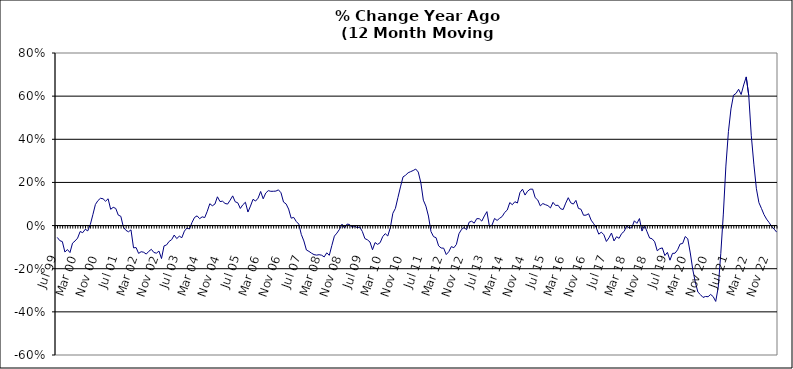
| Category | Series 0 |
|---|---|
| Jul 99 | -0.055 |
| Aug 99 | -0.07 |
| Sep 99 | -0.074 |
| Oct 99 | -0.123 |
| Nov 99 | -0.111 |
| Dec 99 | -0.125 |
| Jan 00 | -0.082 |
| Feb 00 | -0.071 |
| Mar 00 | -0.058 |
| Apr 00 | -0.027 |
| May 00 | -0.033 |
| Jun 00 | -0.017 |
| Jul 00 | -0.025 |
| Aug 00 | 0.005 |
| Sep 00 | 0.05 |
| Oct 00 | 0.098 |
| Nov 00 | 0.116 |
| Dec 00 | 0.127 |
| Jan 01 | 0.124 |
| Feb 01 | 0.113 |
| Mar 01 | 0.124 |
| Apr 01 | 0.075 |
| May 01 | 0.085 |
| Jun 01 | 0.08 |
| Jul 01 | 0.048 |
| Aug 01 | 0.043 |
| Sep 01 | -0.007 |
| Oct 01 | -0.022 |
| Nov 01 | -0.029 |
| Dec 01 | -0.02 |
| Jan 02 | -0.103 |
| Feb 02 | -0.102 |
| Mar 02 | -0.129 |
| Apr 02 | -0.121 |
| May 02 | -0.124 |
| Jun 02 | -0.132 |
| Jul 02 | -0.119 |
| Aug 02 | -0.11 |
| Sep 02 | -0.125 |
| Oct 02 | -0.128 |
| Nov 02 | -0.118 |
| Dec 02 | -0.153 |
| Jan 03 | -0.094 |
| Feb 03 | -0.09 |
| Mar 03 | -0.073 |
| Apr 03 | -0.065 |
| May 03 | -0.044 |
| Jun 03 | -0.06 |
| Jul 03 | -0.049 |
| Aug 03 | -0.056 |
| Sep 03 | -0.026 |
| Oct 03 | -0.012 |
| Nov 03 | -0.016 |
| Dec 03 | 0.014 |
| Jan 04 | 0.038 |
| Feb 04 | 0.045 |
| Mar 04 | 0.032 |
| Apr 04 | 0.041 |
| May 04 | 0.037 |
| Jun 04 | 0.066 |
| Jul 04 | 0.101 |
| Aug 04 | 0.092 |
| Sep 04 | 0.1 |
| Oct 04 | 0.133 |
| Nov 04 | 0.111 |
| Dec 04 | 0.113 |
| Jan 05 | 0.103 |
| Feb 05 | 0.1 |
| Mar 05 | 0.118 |
| Apr 05 | 0.138 |
| May 05 | 0.11 |
| Jun 05 | 0.106 |
| Jul 05 | 0.079 |
| Aug 05 | 0.097 |
| Sep 05 | 0.108 |
| Oct 05 | 0.063 |
| Nov 05 | 0.09 |
| Dec 05 | 0.122 |
| Jan 06 | 0.114 |
| Feb 06 | 0.127 |
| Mar 06 | 0.158 |
| Apr 06 | 0.124 |
| May 06 | 0.151 |
| Jun 06 | 0.162 |
| Jul 06 | 0.159 |
| Aug 06 | 0.159 |
| Sep 06 | 0.16 |
| Oct 06 | 0.166 |
| Nov 06 | 0.152 |
| Dec 06 | 0.109 |
| Jan 07 | 0.101 |
| Feb 07 | 0.076 |
| Mar 07 | 0.034 |
| Apr 07 | 0.038 |
| May 07 | 0.019 |
| Jun 07 | 0.007 |
| Jul 07 | -0.041 |
| Aug 07 | -0.071 |
| Sep 07 | -0.113 |
| Oct 07 | -0.12 |
| Nov 07 | -0.128 |
| Dec 07 | -0.135 |
| Jan 08 | -0.137 |
| Feb 08 | -0.135 |
| Mar 08 | -0.137 |
| Apr 08 | -0.145 |
| May 08 | -0.126 |
| Jun 08 | -0.138 |
| Jul 08 | -0.093 |
| Aug 08 | -0.049 |
| Sep-08 | -0.035 |
| Oct 08 | -0.018 |
| Nov 08 | 0.007 |
| Dec 08 | -0.011 |
| Jan 09 | 0.007 |
| Feb 09 | 0.005 |
| Mar 09 | -0.009 |
| Apr 09 | -0.003 |
| May 09 | -0.01 |
| Jun 09 | -0.007 |
| Jul 09 | -0.027 |
| Aug 09 | -0.06 |
| Sep 09 | -0.066 |
| Oct 09 | -0.076 |
| Nov 09 | -0.112 |
| Dec 09 | -0.079 |
| Jan 10 | -0.087 |
| Feb 10 | -0.079 |
| Mar 10 | -0.052 |
| Apr 10 | -0.037 |
| May 10 | -0.048 |
| Jun 10 | -0.01 |
| Jul 10 | 0.057 |
| Aug 10 | 0.08 |
| Sep 10 | 0.13 |
| Oct 10 | 0.179 |
| Nov 10 | 0.226 |
| Dec 10 | 0.233 |
| Jan 11 | 0.245 |
| Feb 11 | 0.25 |
| Mar 11 | 0.255 |
| Apr 11 | 0.262 |
| May 11 | 0.248 |
| Jun 11 | 0.199 |
| Jul 11 | 0.118 |
| Aug 11 | 0.09 |
| Sep 11 | 0.044 |
| Oct 11 | -0.028 |
| Nov 11 | -0.051 |
| Dec 11 | -0.056 |
| Jan 12 | -0.094 |
| Feb 12 | -0.104 |
| Mar 12 | -0.105 |
| Apr 12 | -0.134 |
| May 12 | -0.121 |
| Jun 12 | -0.098 |
| Jul 12 | -0.103 |
| Aug 12 | -0.087 |
| Sep 12 | -0.038 |
| Oct 12 | -0.018 |
| Nov 12 | -0.009 |
| Dec 12 | -0.019 |
| Jan 13 | 0.016 |
| Feb-13 | 0.02 |
| Mar-13 | 0.011 |
| Apr 13 | 0.032 |
| May 13 | 0.032 |
| Jun-13 | 0.021 |
| Jul 13 | 0.045 |
| Aug 13 | 0.065 |
| Sep 13 | -0.005 |
| Oct 13 | 0.002 |
| Nov 13 | 0.033 |
| Dec 13 | 0.024 |
| Jan 14 | 0.034 |
| Feb-14 | 0.042 |
| Mar 14 | 0.061 |
| Apr 14 | 0.072 |
| May 14 | 0.107 |
| Jun 14 | 0.097 |
| Jul-14 | 0.111 |
| Aug-14 | 0.105 |
| Sep 14 | 0.153 |
| Oct 14 | 0.169 |
| Nov 14 | 0.141 |
| Dec 14 | 0.159 |
| Jan 15 | 0.169 |
| Feb 15 | 0.169 |
| Mar 15 | 0.129 |
| Apr-15 | 0.118 |
| May 15 | 0.091 |
| Jun-15 | 0.102 |
| Jul 15 | 0.097 |
| Aug 15 | 0.092 |
| Sep 15 | 0.082 |
| Oct 15 | 0.108 |
| Nov 15 | 0.093 |
| Dec 15 | 0.094 |
| Jan 16 | 0.078 |
| Feb 16 | 0.075 |
| Mar 16 | 0.104 |
| Apr 16 | 0.129 |
| May 16 | 0.105 |
| Jun 16 | 0.1 |
| Jul 16 | 0.117 |
| Aug 16 | 0.08 |
| Sep 16 | 0.076 |
| Oct 16 | 0.048 |
| Nov 16 | 0.048 |
| Dec 16 | 0.055 |
| Jan 17 | 0.025 |
| Feb 17 | 0.009 |
| Mar 17 | -0.01 |
| Apr 17 | -0.04 |
| May 17 | -0.031 |
| Jun 17 | -0.042 |
| Jul 17 | -0.074 |
| Aug 17 | -0.057 |
| Sep 17 | -0.035 |
| Oct 17 | -0.071 |
| Nov 17 | -0.052 |
| Dec 17 | -0.059 |
| Jan 18 | -0.037 |
| Feb 18 | -0.027 |
| Mar 18 | 0 |
| Apr 18 | -0.012 |
| May 18 | -0.009 |
| Jun 18 | 0.022 |
| Jul 18 | 0.01 |
| Aug 18 | 0.033 |
| Sep 18 | -0.025 |
| Oct 18 | 0.002 |
| Nov 18 | -0.029 |
| Dec 18 | -0.058 |
| Jan 19 | -0.061 |
| Feb 19 | -0.075 |
| Mar 19 | -0.117 |
| Apr 19 | -0.107 |
| May 19 | -0.104 |
| Jun 19 | -0.139 |
| Jul 19 | -0.124 |
| Aug 19 | -0.16 |
| Sep 19 | -0.129 |
| Oct 19 | -0.128 |
| Nov 19 | -0.112 |
| Dec 19 | -0.085 |
| Jan 20 | -0.083 |
| Feb 20 | -0.051 |
| Mar 20 | -0.061 |
| Apr 20 | -0.127 |
| May 20 | -0.206 |
| Jun 20 | -0.264 |
| Jul 20 | -0.308 |
| Aug 20 | -0.32 |
| Sep 20 | -0.333 |
| Oct 20 | -0.329 |
| Nov 20 | -0.33 |
| Dec 20 | -0.319 |
| Jan 21 | -0.329 |
| Feb 21 | -0.352 |
| Mar 21 | -0.286 |
| Apr 21 | -0.129 |
| May 21 | 0.053 |
| Jun 21 | 0.276 |
| Jul 21 | 0.435 |
| Aug 21 | 0.541 |
| Sep 21 | 0.604 |
| Oct 21 | 0.613 |
| Nov 21 | 0.632 |
| Dec 21 | 0.608 |
| Jan 22 | 0.652 |
| Feb 22 | 0.689 |
| Mar 22 | 0.603 |
| Apr 22 | 0.416 |
| May 22 | 0.285 |
| Jun 22 | 0.171 |
| Jul 22 | 0.106 |
| Aug 22 | 0.079 |
| Sep 22 | 0.051 |
| Oct 22 | 0.03 |
| Nov 22 | 0.014 |
| Dec 22 | -0.004 |
| Jan 23 | -0.017 |
| Feb 23 | -0.031 |